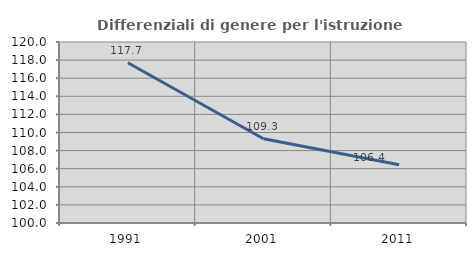
| Category | Differenziali di genere per l'istruzione superiore |
|---|---|
| 1991.0 | 117.705 |
| 2001.0 | 109.303 |
| 2011.0 | 106.438 |